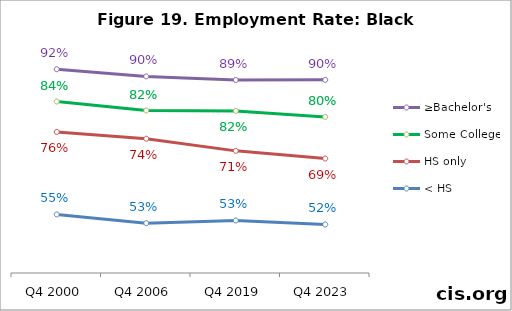
| Category | ≥Bachelor's | Some College | HS only | < HS |
|---|---|---|---|---|
| Q4 2000 | 0.923 | 0.84 | 0.762 | 0.55 |
| Q4 2006 | 0.904 | 0.817 | 0.744 | 0.528 |
| Q4 2019 | 0.895 | 0.816 | 0.713 | 0.535 |
| Q4 2023 | 0.895 | 0.8 | 0.693 | 0.524 |